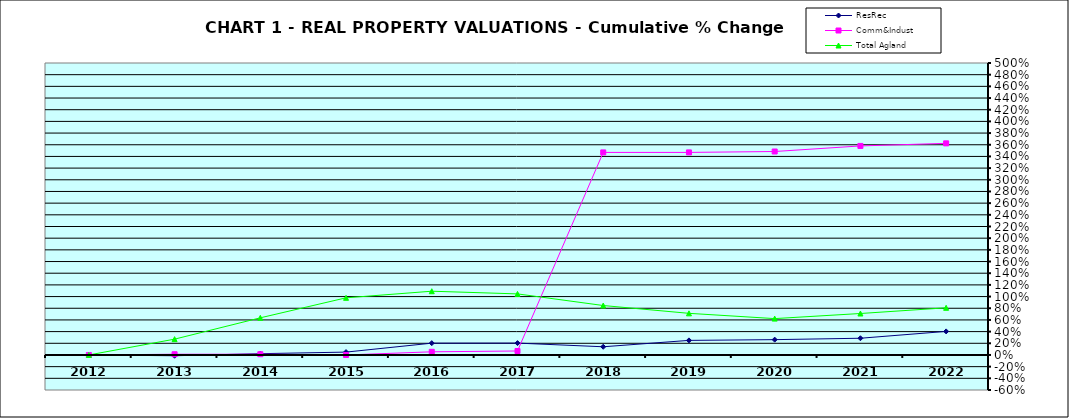
| Category | ResRec | Comm&Indust | Total Agland |
|---|---|---|---|
| 2012.0 | 0 | 0 | 0 |
| 2013.0 | -0.013 | 0.013 | 0.271 |
| 2014.0 | 0.022 | 0.013 | 0.636 |
| 2015.0 | 0.049 | 0 | 0.979 |
| 2016.0 | 0.202 | 0.054 | 1.092 |
| 2017.0 | 0.203 | 0.068 | 1.046 |
| 2018.0 | 0.14 | 3.469 | 0.847 |
| 2019.0 | 0.25 | 3.469 | 0.713 |
| 2020.0 | 0.262 | 3.484 | 0.623 |
| 2021.0 | 0.286 | 3.58 | 0.71 |
| 2022.0 | 0.403 | 3.624 | 0.808 |